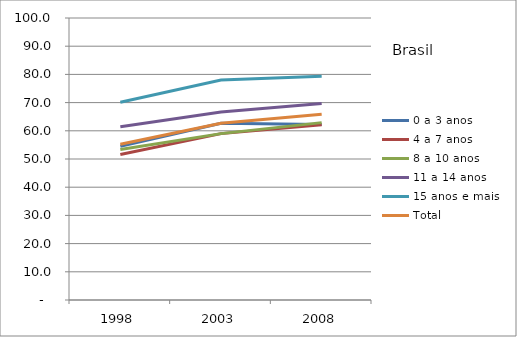
| Category | 0 a 3 anos | 4 a 7 anos | 8 a 10 anos | 11 a 14 anos | 15 anos e mais | Total |
|---|---|---|---|---|---|---|
| 1998.0 | 54.5 | 51.6 | 53.4 | 61.4 | 70.1 | 55.2 |
| 2003.0 | 62.7 | 59 | 59 | 66.7 | 78 | 62.7 |
| 2008.0 | 62.2 | 62.1 | 62.9 | 69.7 | 79.3 | 65.9 |